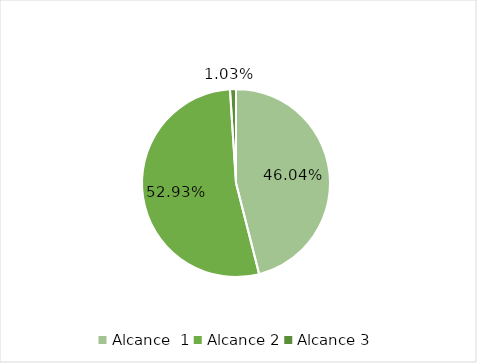
| Category | Series 0 |
|---|---|
| Alcance  1 | 0.46 |
| Alcance 2 | 0.529 |
| Alcance 3 | 0.01 |